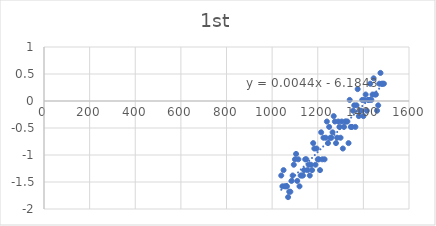
| Category | Series 0 |
|---|---|
| 1040.0 | -1.38 |
| 1045.0 | -1.58 |
| 1050.0 | -1.28 |
| 1055.0 | -1.58 |
| 1060.0 | -1.58 |
| 1065.0 | -1.58 |
| 1070.0 | -1.78 |
| 1075.0 | -1.68 |
| 1080.0 | -1.68 |
| 1085.0 | -1.48 |
| 1090.0 | -1.38 |
| 1095.0 | -1.18 |
| 1100.0 | -1.08 |
| 1105.0 | -0.98 |
| 1110.0 | -1.48 |
| 1115.0 | -1.08 |
| 1120.0 | -1.58 |
| 1125.0 | -1.38 |
| 1130.0 | -1.38 |
| 1135.0 | -1.38 |
| 1140.0 | -1.28 |
| 1145.0 | -1.08 |
| 1150.0 | -1.08 |
| 1155.0 | -1.28 |
| 1160.0 | -1.18 |
| 1165.0 | -1.38 |
| 1170.0 | -1.18 |
| 1175.0 | -1.28 |
| 1180.0 | -0.78 |
| 1185.0 | -0.88 |
| 1190.0 | -1.18 |
| 1195.0 | -0.88 |
| 1200.0 | -1.08 |
| 1205.0 | -1.08 |
| 1210.0 | -1.28 |
| 1215.0 | -0.58 |
| 1220.0 | -1.08 |
| 1225.0 | -0.68 |
| 1230.0 | -1.08 |
| 1235.0 | -0.68 |
| 1240.0 | -0.38 |
| 1245.0 | -0.78 |
| 1250.0 | -0.48 |
| 1255.0 | -0.68 |
| 1260.0 | -0.68 |
| 1265.0 | -0.58 |
| 1270.0 | -0.28 |
| 1275.0 | -0.38 |
| 1280.0 | -0.78 |
| 1285.0 | -0.68 |
| 1290.0 | -0.38 |
| 1295.0 | -0.48 |
| 1300.0 | -0.68 |
| 1305.0 | -0.38 |
| 1310.0 | -0.88 |
| 1315.0 | -0.48 |
| 1320.0 | -0.38 |
| 1325.0 | -0.38 |
| 1330.0 | -0.38 |
| 1335.0 | -0.78 |
| 1340.0 | 0.02 |
| 1345.0 | -0.48 |
| 1350.0 | -0.48 |
| 1355.0 | -0.18 |
| 1360.0 | -0.08 |
| 1365.0 | -0.48 |
| 1370.0 | -0.08 |
| 1375.0 | 0.22 |
| 1380.0 | -0.28 |
| 1385.0 | -0.18 |
| 1390.0 | -0.18 |
| 1395.0 | 0.02 |
| 1400.0 | -0.28 |
| 1405.0 | 0.02 |
| 1410.0 | 0.12 |
| 1415.0 | -0.18 |
| 1420.0 | 0.02 |
| 1425.0 | 0.02 |
| 1430.0 | 0.32 |
| 1435.0 | 0.02 |
| 1440.0 | 0.12 |
| 1445.0 | 0.42 |
| 1450.0 | 0.12 |
| 1455.0 | 0.12 |
| 1460.0 | -0.18 |
| 1465.0 | -0.08 |
| 1470.0 | 0.32 |
| 1475.0 | 0.52 |
| 1480.0 | 0.32 |
| 1485.0 | 0.32 |
| 1490.0 | 0.32 |